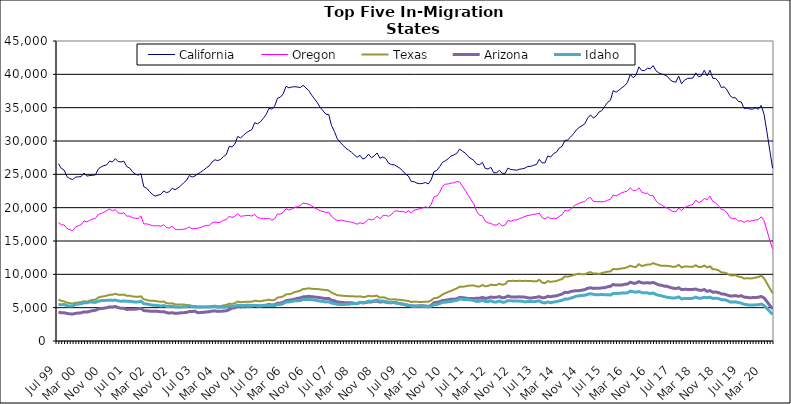
| Category | California | Oregon | Texas | Arizona | Idaho |
|---|---|---|---|---|---|
| Jul 99 | 26605 | 17749 | 6209 | 4339 | 5471 |
| Aug 99 | 25882 | 17447 | 6022 | 4228 | 5444 |
| Sep 99 | 25644 | 17401 | 5941 | 4237 | 5488 |
| Oct 99 | 24669 | 16875 | 5751 | 4134 | 5279 |
| Nov 99 | 24353 | 16701 | 5680 | 4073 | 5260 |
| Dec 99 | 24218 | 16570 | 5619 | 4042 | 5269 |
| Jan 00 | 24574 | 17109 | 5736 | 4142 | 5485 |
| Feb 00 | 24620 | 17295 | 5789 | 4192 | 5530 |
| Mar 00 | 24655 | 17436 | 5826 | 4226 | 5590 |
| Apr 00 | 25195 | 18009 | 5980 | 4375 | 5748 |
| May 00 | 24730 | 17875 | 5897 | 4337 | 5729 |
| Jun 00 | 24825 | 18113 | 6070 | 4444 | 5853 |
| Jul 00 | 24857 | 18294 | 6163 | 4555 | 5824 |
| Aug 00 | 24913 | 18376 | 6199 | 4603 | 5788 |
| Sep 00 | 25792 | 18971 | 6529 | 4804 | 5976 |
| Oct 00 | 26106 | 19135 | 6643 | 4870 | 6058 |
| Nov 00 | 26315 | 19306 | 6705 | 4926 | 6085 |
| Dec 00 | 26415 | 19570 | 6793 | 4991 | 6096 |
| Jan 01 | 26995 | 19781 | 6942 | 5122 | 6119 |
| Feb 01 | 26851 | 19519 | 6948 | 5089 | 6090 |
| Mar 01 | 27352 | 19720 | 7080 | 5180 | 6143 |
| Apr 01 | 26918 | 19221 | 6943 | 5020 | 6020 |
| May 01 | 26848 | 19126 | 6924 | 4899 | 5950 |
| Jun 01 | 26974 | 19241 | 6959 | 4895 | 6019 |
| Jul 01 | 26172 | 18725 | 6778 | 4737 | 5951 |
| Aug 01 | 25943 | 18736 | 6810 | 4757 | 5973 |
| Sep 01 | 25399 | 18514 | 6688 | 4753 | 5895 |
| Oct 01 | 25050 | 18415 | 6650 | 4780 | 5833 |
| Nov 01 | 24873 | 18381 | 6631 | 4826 | 5850 |
| Dec 01 | 25099 | 18765 | 6708 | 4898 | 5969 |
| Jan 02 | 23158 | 17561 | 6261 | 4560 | 5595 |
| Feb 02 | 22926 | 17573 | 6162 | 4531 | 5560 |
| Mar 02 | 22433 | 17452 | 6052 | 4481 | 5458 |
| Apr 02 | 22012 | 17314 | 6046 | 4458 | 5380 |
| May 02 | 21733 | 17267 | 6007 | 4452 | 5358 |
| Jun 02 | 21876 | 17298 | 5933 | 4444 | 5315 |
| Jul 02 | 21997 | 17209 | 5873 | 4383 | 5243 |
| Aug 02 | 22507 | 17436 | 5929 | 4407 | 5315 |
| Sep 02 | 22244 | 17010 | 5672 | 4248 | 5192 |
| Oct 02 | 22406 | 16952 | 5625 | 4191 | 5167 |
| Nov 02 | 22922 | 17223 | 5663 | 4242 | 5221 |
| Dec 02 | 22693 | 16770 | 5499 | 4142 | 5120 |
| Jan 03 | 22964 | 16694 | 5463 | 4166 | 5089 |
| Feb 03 | 23276 | 16727 | 5461 | 4226 | 5077 |
| Mar 03 | 23736 | 16766 | 5486 | 4251 | 5145 |
| Apr 03 | 24079 | 16859 | 5389 | 4289 | 5145 |
| May 03 | 24821 | 17117 | 5378 | 4415 | 5254 |
| Jun 03 | 24592 | 16812 | 5273 | 4426 | 5135 |
| Jul 03 | 24754 | 16875 | 5226 | 4466 | 5124 |
| Aug 03 | 25092 | 16922 | 5181 | 4244 | 5100 |
| Sep 03 | 25316 | 17036 | 5181 | 4279 | 5086 |
| Oct 03 | 25622 | 17228 | 5139 | 4301 | 5110 |
| Nov 03 | 25984 | 17335 | 5175 | 4362 | 5091 |
| Dec 03 | 26269 | 17350 | 5189 | 4396 | 5113 |
| Jan 04 | 26852 | 17734 | 5255 | 4492 | 5152 |
| Feb 04 | 27184 | 17860 | 5301 | 4502 | 5183 |
| Mar 04 | 27062 | 17757 | 5227 | 4443 | 5056 |
| Apr 04 | 27238 | 17840 | 5227 | 4461 | 5104 |
| May 04 | 27671 | 18113 | 5345 | 4493 | 5095 |
| Jun 04 | 27949 | 18201 | 5416 | 4532 | 5103 |
| Jul 04 | 29172 | 18727 | 5597 | 4697 | 5231 |
| Aug 04 | 29122 | 18529 | 5561 | 4945 | 5197 |
| Sep 04 | 29542 | 18678 | 5656 | 4976 | 5237 |
| Oct 04 | 30674 | 19108 | 5922 | 5188 | 5363 |
| Nov 04 | 30472 | 18716 | 5823 | 5106 | 5321 |
| Dec 04 | 30831 | 18755 | 5838 | 5135 | 5312 |
| Jan 05 | 31224 | 18823 | 5906 | 5155 | 5374 |
| Feb 05 | 31495 | 18842 | 5898 | 5168 | 5357 |
| Mar 05 | 31714 | 18738 | 5894 | 5212 | 5313 |
| Apr 05 | 32750 | 18998 | 6060 | 5340 | 5350 |
| May 05 | 32575 | 18504 | 5989 | 5269 | 5276 |
| Jun 05 | 32898 | 18414 | 5954 | 5252 | 5271 |
| Jul 05 | 33384 | 18395 | 6062 | 5322 | 5322 |
| Aug 05 | 33964 | 18381 | 6113 | 5375 | 5316 |
| Sep 05 | 34897 | 18426 | 6206 | 5493 | 5362 |
| Oct 05 | 34780 | 18132 | 6100 | 5408 | 5308 |
| Nov 05 | 35223 | 18332 | 6162 | 5434 | 5314 |
| Dec 05 | 36415 | 19047 | 6508 | 5658 | 5487 |
| Jan 06 | 36567 | 19032 | 6576 | 5688 | 5480 |
| Feb 06 | 37074 | 19257 | 6692 | 5792 | 5616 |
| Mar 06 | 38207 | 19845 | 6993 | 6052 | 5850 |
| Apr 06 | 37976 | 19637 | 7024 | 6101 | 5864 |
| May 06 | 38099 | 19781 | 7114 | 6178 | 5943 |
| Jun 06 | 38141 | 20061 | 7331 | 6276 | 6018 |
| Jul 06 | 38097 | 20111 | 7431 | 6399 | 6046 |
| Aug 06 | 38021 | 20333 | 7542 | 6450 | 6064 |
| Sep 06 | 38349 | 20686 | 7798 | 6627 | 6232 |
| Oct 06 | 37947 | 20591 | 7825 | 6647 | 6216 |
| Nov 06 | 37565 | 20526 | 7907 | 6707 | 6244 |
| Dec 06 | 36884 | 20272 | 7840 | 6648 | 6192 |
| Jan 07 | 36321 | 19984 | 7789 | 6597 | 6151 |
| Feb 07 | 35752 | 19752 | 7799 | 6554 | 6048 |
| Mar 07 | 35025 | 19547 | 7737 | 6487 | 5989 |
| Apr 07 | 34534 | 19412 | 7685 | 6430 | 5937 |
| May 07 | 34022 | 19296 | 7654 | 6353 | 5858 |
| Jun 07 | 33974 | 19318 | 7577 | 6390 | 5886 |
| Jul 07 | 32298 | 18677 | 7250 | 6117 | 5682 |
| Aug 07 | 31436 | 18322 | 7070 | 6034 | 5617 |
| Sep 07 | 30331 | 18087 | 6853 | 5847 | 5500 |
| Oct 07 | 29813 | 18108 | 6839 | 5821 | 5489 |
| Nov 07 | 29384 | 18105 | 6777 | 5769 | 5481 |
| Dec 07 | 28923 | 17949 | 6760 | 5733 | 5499 |
| Jan 08 | 28627 | 17890 | 6721 | 5732 | 5521 |
| Feb 08 | 28328 | 17834 | 6719 | 5749 | 5579 |
| Mar 08 | 27911 | 17680 | 6690 | 5650 | 5614 |
| Apr 08 | 27543 | 17512 | 6656 | 5612 | 5635 |
| May 08 | 27856 | 17754 | 6705 | 5774 | 5798 |
| Jun 08 | 27287 | 17589 | 6593 | 5717 | 5745 |
| Jul 08 | 27495 | 17834 | 6623 | 5761 | 5807 |
| Aug 08 | 28018 | 18309 | 6789 | 5867 | 5982 |
| Sep-08 | 27491 | 18164 | 6708 | 5864 | 5954 |
| Oct 08 | 27771 | 18291 | 6755 | 5942 | 6032 |
| Nov 08 | 28206 | 18706 | 6787 | 5970 | 6150 |
| Dec 08 | 27408 | 18353 | 6505 | 5832 | 5975 |
| Jan 09 | 27601 | 18778 | 6569 | 5890 | 5995 |
| Feb 09 | 27394 | 18863 | 6483 | 5845 | 5936 |
| Mar 09 | 26690 | 18694 | 6273 | 5751 | 5806 |
| Apr 09 | 26461 | 18943 | 6222 | 5735 | 5777 |
| May 09 | 26435 | 19470 | 6272 | 5819 | 5767 |
| Jun 09 | 26187 | 19522 | 6199 | 5700 | 5649 |
| Jul 09 | 25906 | 19408 | 6171 | 5603 | 5617 |
| Aug 09 | 25525 | 19469 | 6128 | 5533 | 5540 |
| Sep 09 | 25050 | 19249 | 6059 | 5405 | 5437 |
| Oct 09 | 24741 | 19529 | 6004 | 5349 | 5369 |
| Nov 09 | 23928 | 19187 | 5854 | 5271 | 5248 |
| Dec 09 | 23899 | 19607 | 5886 | 5261 | 5195 |
| Jan 10 | 23676 | 19703 | 5881 | 5232 | 5234 |
| Feb 10 | 23592 | 19845 | 5850 | 5272 | 5236 |
| Mar 10 | 23634 | 19946 | 5864 | 5278 | 5219 |
| Apr 10 | 23774 | 20134 | 5889 | 5257 | 5201 |
| May 10 | 23567 | 19966 | 5897 | 5172 | 5105 |
| Jun 10 | 24166 | 20464 | 6087 | 5356 | 5237 |
| Jul 10 | 25410 | 21627 | 6417 | 5742 | 5452 |
| Aug 10 | 25586 | 21744 | 6465 | 5797 | 5491 |
| Sep 10 | 26150 | 22314 | 6667 | 5907 | 5609 |
| Oct 10 | 26807 | 23219 | 6986 | 6070 | 5831 |
| Nov 10 | 27033 | 23520 | 7179 | 6100 | 5810 |
| Dec 10 | 27332 | 23551 | 7361 | 6182 | 5898 |
| Jan 11 | 27769 | 23697 | 7525 | 6276 | 5938 |
| Feb 11 | 27898 | 23718 | 7708 | 6267 | 6016 |
| Mar 11 | 28155 | 23921 | 7890 | 6330 | 6081 |
| Apr 11 | 28790 | 23847 | 8146 | 6544 | 6305 |
| May 11 | 28471 | 23215 | 8131 | 6502 | 6248 |
| Jun 11 | 28191 | 22580 | 8199 | 6445 | 6217 |
| Jul 11 | 27678 | 21867 | 8291 | 6368 | 6202 |
| Aug 11 | 27372 | 21203 | 8321 | 6356 | 6146 |
| Sep 11 | 27082 | 20570 | 8341 | 6387 | 6075 |
| Oct 11 | 26528 | 19442 | 8191 | 6402 | 5932 |
| Nov 11 | 26440 | 18872 | 8176 | 6426 | 5968 |
| Dec 11 | 26770 | 18784 | 8401 | 6533 | 6106 |
| Jan 12 | 25901 | 17963 | 8202 | 6390 | 5933 |
| Feb 12 | 25796 | 17718 | 8266 | 6456 | 5900 |
| Mar 12 | 26042 | 17647 | 8456 | 6600 | 6054 |
| Apr 12 | 25239 | 17386 | 8388 | 6534 | 5838 |
| May 12 | 25238 | 17407 | 8401 | 6558 | 5854 |
| Jun 12 | 25593 | 17673 | 8594 | 6669 | 6009 |
| Jul 12 | 25155 | 17237 | 8432 | 6474 | 5817 |
| Aug 12 | 25146 | 17391 | 8536 | 6539 | 5842 |
| Sep 12 | 25942 | 18102 | 8989 | 6759 | 6061 |
| Oct 12 | 25718 | 17953 | 9012 | 6618 | 6027 |
| Nov 12 | 25677 | 18134 | 9032 | 6611 | 6009 |
| Dec 12 | 25619 | 18166 | 8981 | 6601 | 5999 |
| Jan 13 | 25757 | 18344 | 9051 | 6627 | 5989 |
| Feb-13 | 25830 | 18512 | 9001 | 6606 | 5968 |
| Mar-13 | 25940 | 18689 | 9021 | 6577 | 5853 |
| Apr 13 | 26187 | 18844 | 9013 | 6478 | 5925 |
| May 13 | 26192 | 18884 | 9003 | 6431 | 5924 |
| Jun-13 | 26362 | 19013 | 8948 | 6508 | 5896 |
| Jul 13 | 26467 | 19037 | 8958 | 6559 | 5948 |
| Aug 13 | 27253 | 19198 | 9174 | 6655 | 6020 |
| Sep 13 | 26711 | 18501 | 8747 | 6489 | 5775 |
| Oct 13 | 26733 | 18301 | 8681 | 6511 | 5711 |
| Nov 13 | 27767 | 18620 | 8989 | 6709 | 5860 |
| Dec 13 | 27583 | 18320 | 8863 | 6637 | 5740 |
| Jan 14 | 28107 | 18409 | 8939 | 6735 | 5843 |
| Feb-14 | 28313 | 18383 | 8989 | 6779 | 5893 |
| Mar 14 | 28934 | 18696 | 9160 | 6918 | 6015 |
| Apr 14 | 29192 | 18946 | 9291 | 7036 | 6099 |
| May 14 | 30069 | 19603 | 9701 | 7314 | 6304 |
| Jun 14 | 30163 | 19487 | 9641 | 7252 | 6293 |
| Jul-14 | 30587 | 19754 | 9752 | 7415 | 6427 |
| Aug-14 | 31074 | 20201 | 9882 | 7499 | 6557 |
| Sep 14 | 31656 | 20459 | 9997 | 7536 | 6719 |
| Oct 14 | 32037 | 20663 | 10109 | 7555 | 6786 |
| Nov 14 | 32278 | 20825 | 9992 | 7628 | 6831 |
| Dec 14 | 32578 | 20918 | 10006 | 7705 | 6860 |
| Jan 15 | 33414 | 21396 | 10213 | 7906 | 7000 |
| Feb 15 | 33922 | 21518 | 10337 | 7982 | 7083 |
| Mar 15 | 33447 | 20942 | 10122 | 7891 | 7006 |
| Apr-15 | 33731 | 20893 | 10138 | 7906 | 6931 |
| May 15 | 34343 | 20902 | 10053 | 7895 | 6952 |
| Jun-15 | 34572 | 20870 | 10192 | 7973 | 6966 |
| Jul 15 | 35185 | 20916 | 10303 | 8000 | 6949 |
| Aug 15 | 35780 | 21115 | 10399 | 8126 | 6938 |
| Sep 15 | 36109 | 21246 | 10428 | 8207 | 6896 |
| Oct 15 | 37555 | 21908 | 10813 | 8477 | 7140 |
| Nov 15 | 37319 | 21750 | 10763 | 8390 | 7112 |
| Dec 15 | 37624 | 21990 | 10807 | 8395 | 7149 |
| Jan 16 | 37978 | 22248 | 10892 | 8388 | 7201 |
| Feb 16 | 38285 | 22369 | 10951 | 8508 | 7192 |
| Mar 16 | 38792 | 22506 | 11075 | 8547 | 7226 |
| Apr 16 | 39994 | 22999 | 11286 | 8815 | 7487 |
| May 16 | 39488 | 22548 | 11132 | 8673 | 7382 |
| Jun 16 | 39864 | 22556 | 11100 | 8682 | 7315 |
| Jul 16 | 41123 | 22989 | 11516 | 8903 | 7420 |
| Aug 16 | 40573 | 22333 | 11251 | 8731 | 7261 |
| Sep 16 | 40560 | 22162 | 11340 | 8692 | 7216 |
| Oct 16 | 40923 | 22172 | 11456 | 8742 | 7233 |
| Nov 16 | 40817 | 21818 | 11459 | 8685 | 7101 |
| Dec 16 | 41311 | 21815 | 11681 | 8783 | 7203 |
| Jan 17 | 40543 | 21029 | 11524 | 8609 | 6982 |
| Feb 17 | 40218 | 20613 | 11385 | 8416 | 6852 |
| Mar 17 | 40052 | 20425 | 11276 | 8354 | 6775 |
| Apr 17 | 39913 | 20147 | 11297 | 8218 | 6653 |
| May 17 | 39695 | 19910 | 11265 | 8196 | 6552 |
| Jun 17 | 39177 | 19650 | 11225 | 8034 | 6500 |
| Jul 17 | 38901 | 19419 | 11115 | 7923 | 6429 |
| Aug 17 | 38827 | 19389 | 11168 | 7867 | 6479 |
| Sep 17 | 39736 | 19936 | 11426 | 7991 | 6609 |
| Oct 17 | 38576 | 19547 | 11041 | 7708 | 6315 |
| Nov 17 | 39108 | 20013 | 11158 | 7746 | 6381 |
| Dec 17 | 39359 | 20202 | 11185 | 7743 | 6366 |
| Jan 18 | 39420 | 20362 | 11118 | 7736 | 6380 |
| Feb 18 | 39440 | 20476 | 11128 | 7741 | 6407 |
| Mar 18 | 40218 | 21106 | 11362 | 7789 | 6578 |
| Apr 18 | 39637 | 20788 | 11111 | 7642 | 6423 |
| May 18 | 39777 | 20933 | 11097 | 7591 | 6430 |
| Jun 18 | 40602 | 21381 | 11317 | 7721 | 6554 |
| Jul 18 | 39767 | 21189 | 11038 | 7445 | 6489 |
| Aug 18 | 40608 | 21729 | 11200 | 7560 | 6569 |
| Sep 18 | 39395 | 20916 | 10772 | 7318 | 6383 |
| Oct 18 | 39383 | 20724 | 10740 | 7344 | 6429 |
| Nov 18 | 38891 | 20265 | 10605 | 7255 | 6365 |
| Dec 18 | 38013 | 19741 | 10292 | 7069 | 6205 |
| Jan 19 | 38130 | 19643 | 10261 | 7032 | 6203 |
| Feb 19 | 37658 | 19237 | 10132 | 6892 | 6073 |
| Mar 19 | 36831 | 18492 | 9848 | 6766 | 5863 |
| Apr 19 | 36492 | 18349 | 9839 | 6763 | 5827 |
| May 19 | 36481 | 18407 | 9867 | 6809 | 5873 |
| Jun 19 | 35925 | 17998 | 9661 | 6698 | 5761 |
| Jul 19 | 35843 | 18049 | 9598 | 6800 | 5673 |
| Aug 19 | 34870 | 17785 | 9361 | 6577 | 5512 |
| Sep 19 | 34945 | 18038 | 9428 | 6547 | 5437 |
| Oct 19 | 34802 | 17977 | 9385 | 6483 | 5390 |
| Nov 19 | 34775 | 18072 | 9403 | 6511 | 5401 |
| Dec 19 | 34976 | 18140 | 9518 | 6521 | 5419 |
| Jan 20 | 34774 | 18209 | 9594 | 6561 | 5434 |
| Feb 20 | 35352 | 18632 | 9804 | 6682 | 5543 |
| Mar 20 | 34013 | 18041 | 9411 | 6464 | 5330 |
| Apr 20 | 31385 | 16629 | 8666 | 5922 | 4906 |
| May 20 | 28657 | 15123 | 7927 | 5355 | 4419 |
| Jun 20 | 25915 | 13817 | 7164 | 4815 | 3992 |